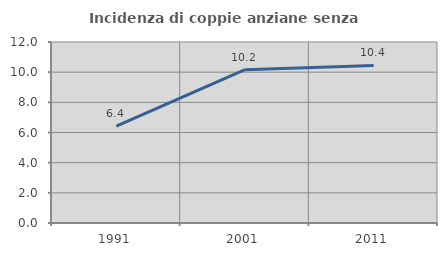
| Category | Incidenza di coppie anziane senza figli  |
|---|---|
| 1991.0 | 6.42 |
| 2001.0 | 10.162 |
| 2011.0 | 10.442 |